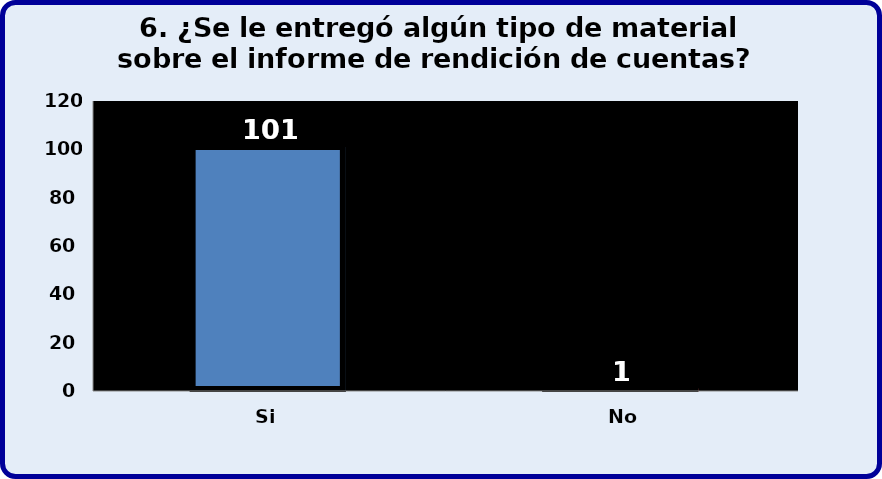
| Category | Series 0 |
|---|---|
| Si | 101 |
| No | 1 |